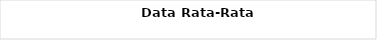
| Category | Korporasi Ritel Mikro KPR Non
KPR |
|---|---|
| 0 | 8.664 |
| 1 | 9.645 |
| 2 | 11.63 |
| 3 | 9.243 |
| 4 | 10.23 |